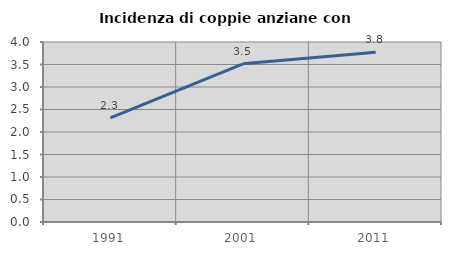
| Category | Incidenza di coppie anziane con figli |
|---|---|
| 1991.0 | 2.313 |
| 2001.0 | 3.514 |
| 2011.0 | 3.771 |